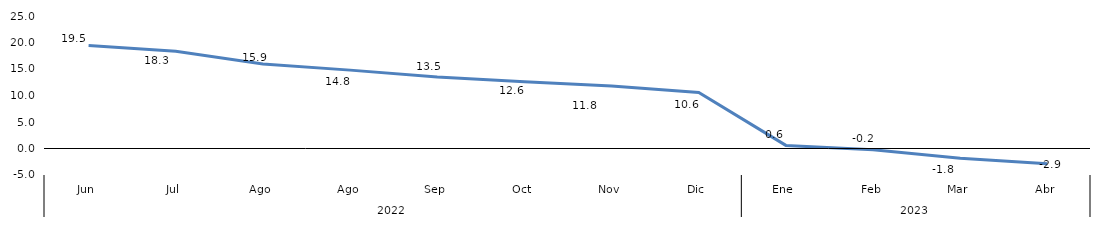
| Category | Bogotá |
|---|---|
| 0 | 19.453 |
| 1 | 18.342 |
| 2 | 15.94 |
| 3 | 14.788 |
| 4 | 13.477 |
| 5 | 12.611 |
| 6 | 11.788 |
| 7 | 10.573 |
| 8 | 0.585 |
| 9 | -0.241 |
| 10 | -1.84 |
| 11 | -2.891 |